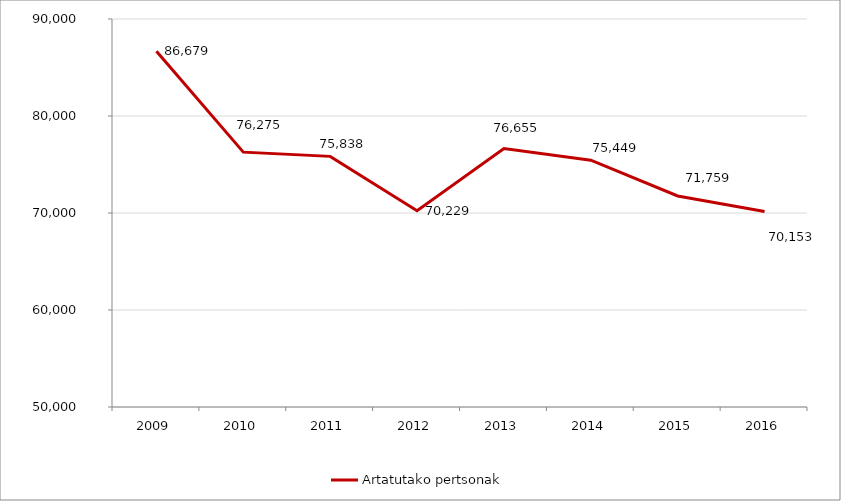
| Category | Artatutako pertsonak |
|---|---|
| 2009.0 | 86679 |
| 2010.0 | 76275 |
| 2011.0 | 75838 |
| 2012.0 | 70229 |
| 2013.0 | 76655 |
| 2014.0 | 75449 |
| 2015.0 | 71759 |
| 2016.0 | 70153 |